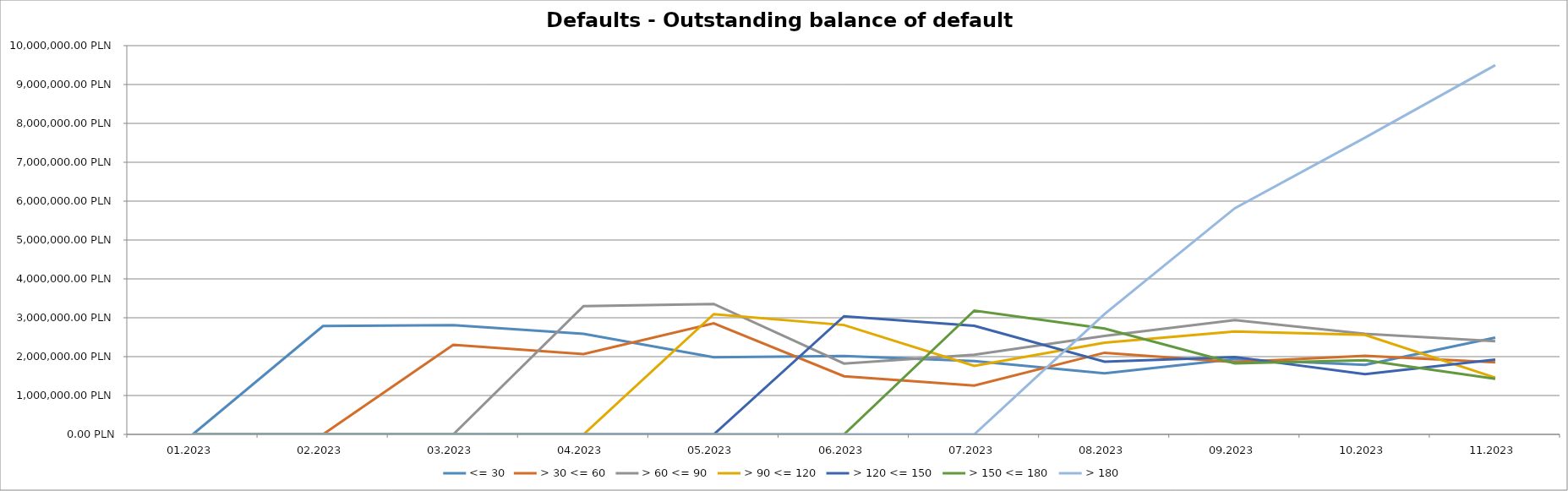
| Category | <= 30 | > 30 <= 60 | > 60 <= 90 | > 90 <= 120 | > 120 <= 150 | > 150 <= 180 | > 180 |
|---|---|---|---|---|---|---|---|
| 01.2023 | 0 | 0 | 0 | 0 | 0 | 0 | 0 |
| 02.2023 | 2788519.82 | 0 | 0 | 0 | 0 | 0 | 0 |
| 03.2023 | 2811517.14 | 2305154.07 | 0 | 0 | 0 | 0 | 0 |
| 04.2023 | 2584791.3 | 2064675.87 | 3301101.31 | 0 | 0 | 0 | 0 |
| 05.2023 | 1985441.56 | 2858398.5 | 3353485.78 | 3091988.77 | 0 | 0 | 0 |
| 06.2023 | 2016845.02 | 1496657.8 | 1822162.63 | 2812422.86 | 3037767.68 | 0 | 0 |
| 07.2023 | 1886118.05 | 1257979.4 | 2047168.21 | 1762916.26 | 2793763.11 | 3184053.47 | 0 |
| 08.2023 | 1572650.17 | 2099798.77 | 2534461.69 | 2357426.74 | 1871124.51 | 2723545.23 | 3093972.9 |
| 09.2023 | 1936023.84 | 1858916.55 | 2940706.37 | 2644290.89 | 1991761.95 | 1826544.8 | 5816448.05 |
| 10.2023 | 1787856.09 | 2019010.42 | 2585069.36 | 2560620.78 | 1548143.78 | 1909160.81 | 7632122.35 |
| 11.2023 | 2487439.47 | 1854213.59 | 2398255.83 | 1460739.8 | 1923073.63 | 1431220.99 | 9496137.88 |